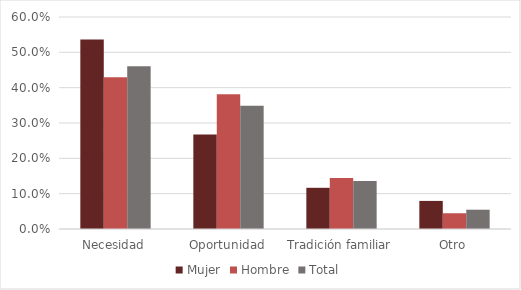
| Category | Mujer | Hombre | Total |
|---|---|---|---|
| Necesidad | 0.536 | 0.43 | 0.46 |
| Oportunidad | 0.268 | 0.381 | 0.349 |
| Tradición familiar | 0.117 | 0.144 | 0.136 |
| Otro | 0.08 | 0.045 | 0.055 |